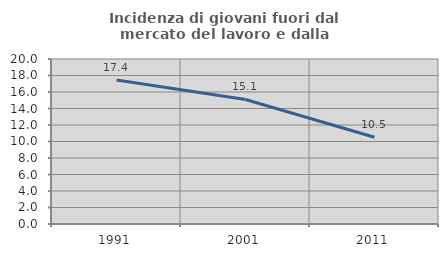
| Category | Incidenza di giovani fuori dal mercato del lavoro e dalla formazione  |
|---|---|
| 1991.0 | 17.448 |
| 2001.0 | 15.098 |
| 2011.0 | 10.512 |